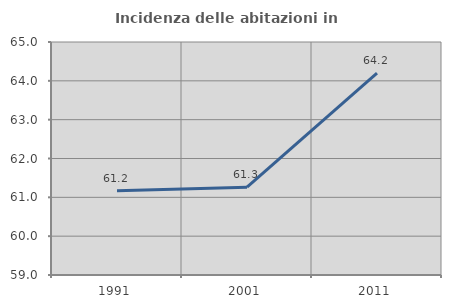
| Category | Incidenza delle abitazioni in proprietà  |
|---|---|
| 1991.0 | 61.167 |
| 2001.0 | 61.26 |
| 2011.0 | 64.202 |